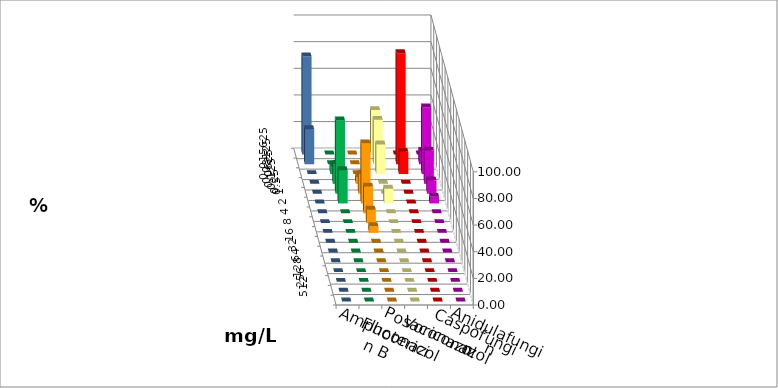
| Category | Amphotericin B | Fluconazol | Posaconazol | Voriconazol | Caspofungin | Anidulafungin |
|---|---|---|---|---|---|---|
| 0.015625 | 0 | 0 | 33.333 | 0 | 0 | 73.684 |
| 0.03125 | 0 | 0 | 33.333 | 83.333 | 10 | 26.316 |
| 0.0625 | 5 | 0 | 22.222 | 16.667 | 50 | 0 |
| 0.125 | 15 | 5 | 0 | 0 | 25 | 0 |
| 0.25 | 55 | 15 | 0 | 0 | 10 | 0 |
| 0.5 | 25 | 45 | 11.111 | 0 | 5 | 0 |
| 1.0 | 0 | 20 | 0 | 0 | 0 | 0 |
| 2.0 | 0 | 10 | 0 | 0 | 0 | 0 |
| 4.0 | 0 | 5 | 0 | 0 | 0 | 0 |
| 8.0 | 0 | 0 | 0 | 0 | 0 | 0 |
| 16.0 | 0 | 0 | 0 | 0 | 0 | 0 |
| 32.0 | 0 | 0 | 0 | 0 | 0 | 0 |
| 64.0 | 0 | 0 | 0 | 0 | 0 | 0 |
| 128.0 | 0 | 0 | 0 | 0 | 0 | 0 |
| 256.0 | 0 | 0 | 0 | 0 | 0 | 0 |
| 512.0 | 0 | 0 | 0 | 0 | 0 | 0 |